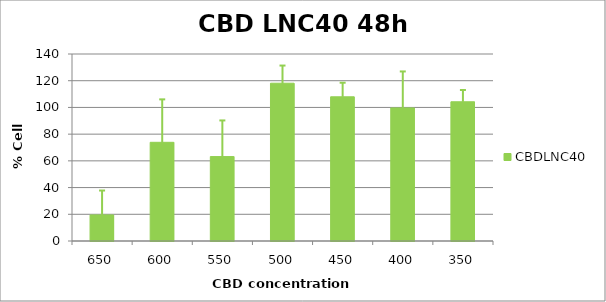
| Category | CBDLNC40 |
|---|---|
| 650.0 | 19.501 |
| 600.0 | 73.888 |
| 550.0 | 63.211 |
| 500.0 | 118.134 |
| 450.0 | 107.956 |
| 400.0 | 99.622 |
| 350.0 | 104.23 |